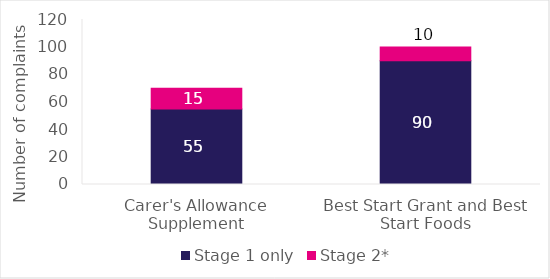
| Category | Stage 1 only | Stage 2* |
|---|---|---|
| Carer's Allowance Supplement | 55 | 15 |
| Best Start Grant and Best Start Foods | 90 | 10 |